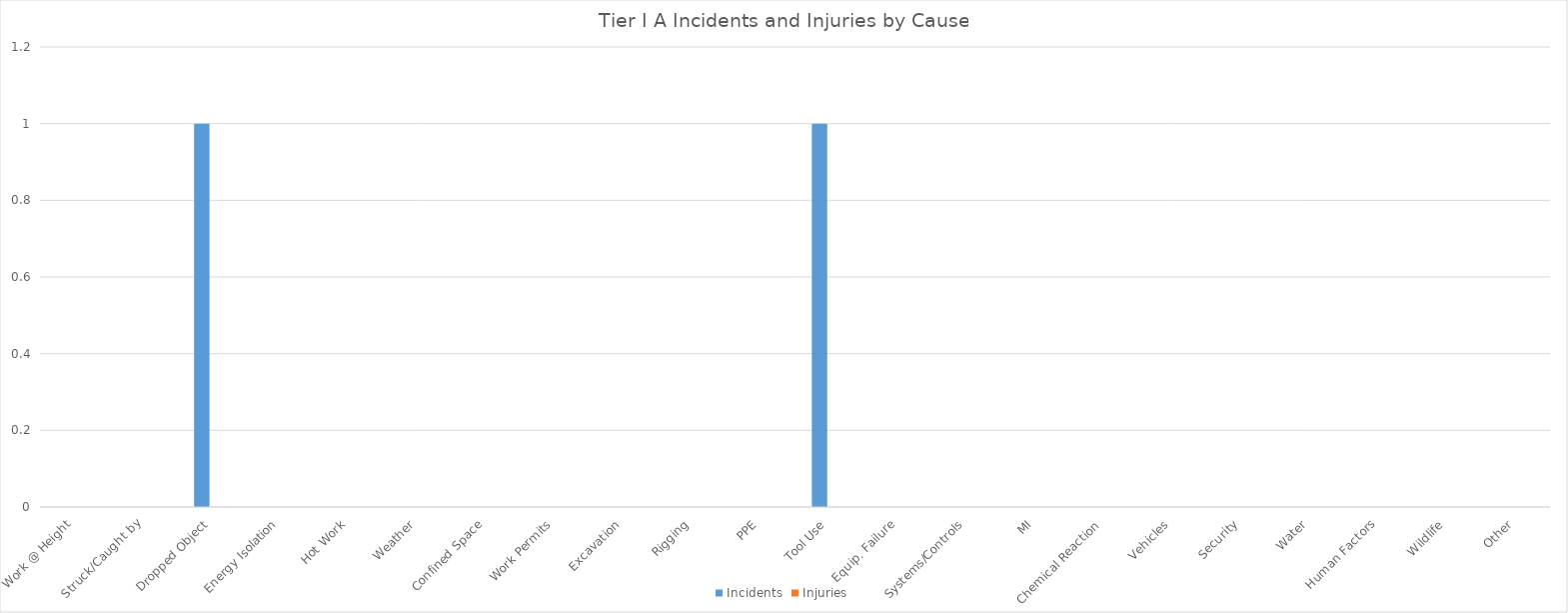
| Category | Incidents | Injuries |
|---|---|---|
| Work @ Height | 0 | 0 |
| Struck/Caught by | 0 | 0 |
| Dropped Object | 1 | 0 |
| Energy Isolation | 0 | 0 |
| Hot Work | 0 | 0 |
| Weather | 0 | 0 |
| Confined Space | 0 | 0 |
| Work Permits | 0 | 0 |
| Excavation | 0 | 0 |
| Rigging | 0 | 0 |
| PPE | 0 | 0 |
| Tool Use | 1 | 0 |
| Equip. Failure | 0 | 0 |
| Systems/Controls | 0 | 0 |
| MI | 0 | 0 |
| Chemical Reaction | 0 | 0 |
| Vehicles | 0 | 0 |
| Security | 0 | 0 |
| Water | 0 | 0 |
| Human Factors | 0 | 0 |
| Wildlife | 0 | 0 |
| Other | 0 | 0 |